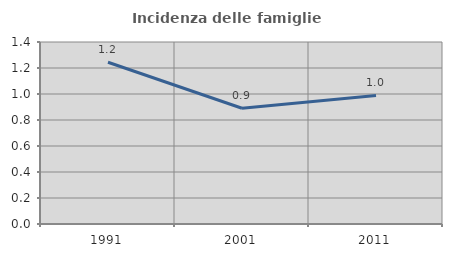
| Category | Incidenza delle famiglie numerose |
|---|---|
| 1991.0 | 1.245 |
| 2001.0 | 0.89 |
| 2011.0 | 0.989 |